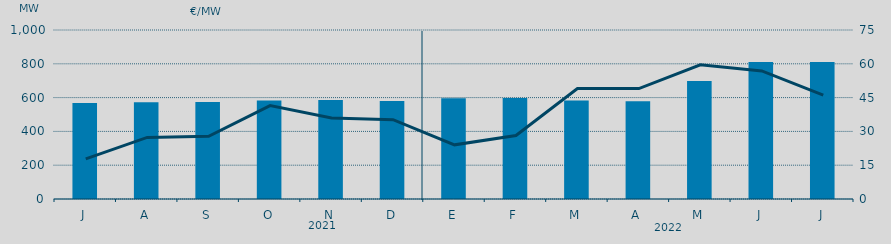
| Category | Potencia media a subir |
|---|---|
| J | 568.418 |
| A | 571.758 |
| S | 574.157 |
| O | 583.016 |
| N | 586.378 |
| D | 579.847 |
| E | 595.423 |
| F | 598.173 |
| M | 582.265 |
| A | 578.1 |
| M | 698 |
| J | 810.166 |
| J | 810.419 |